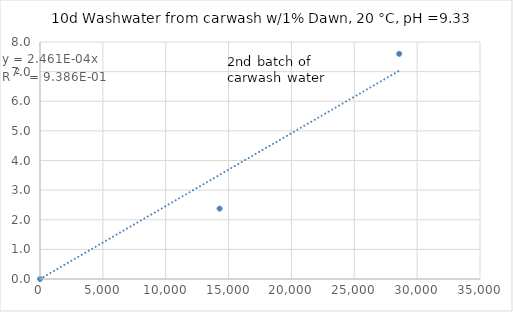
| Category | Series 0 |
|---|---|
| 0.0 | 0 |
| 14285.714285714286 | 2.376 |
| 28571.428571428572 | 7.6 |